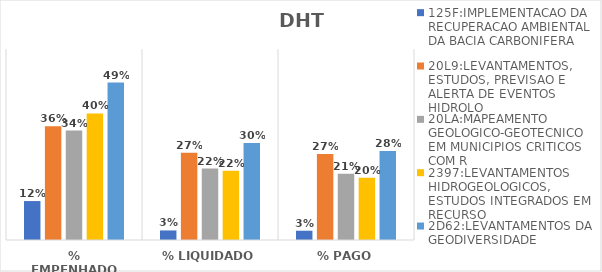
| Category | 125F:IMPLEMENTACAO DA RECUPERACAO AMBIENTAL DA BACIA CARBONIFERA | 20L9:LEVANTAMENTOS, ESTUDOS, PREVISAO E ALERTA DE EVENTOS HIDROLO | 20LA:MAPEAMENTO GEOLOGICO-GEOTECNICO EM MUNICIPIOS CRITICOS COM R | 2397:LEVANTAMENTOS HIDROGEOLOGICOS, ESTUDOS INTEGRADOS EM RECURSO | 2D62:LEVANTAMENTOS DA GEODIVERSIDADE |
|---|---|---|---|---|---|
| % EMPENHADO | 0.122 | 0.357 | 0.344 | 0.398 | 0.495 |
| % LIQUIDADO | 0.03 | 0.274 | 0.224 | 0.217 | 0.305 |
| % PAGO | 0.029 | 0.271 | 0.208 | 0.195 | 0.28 |